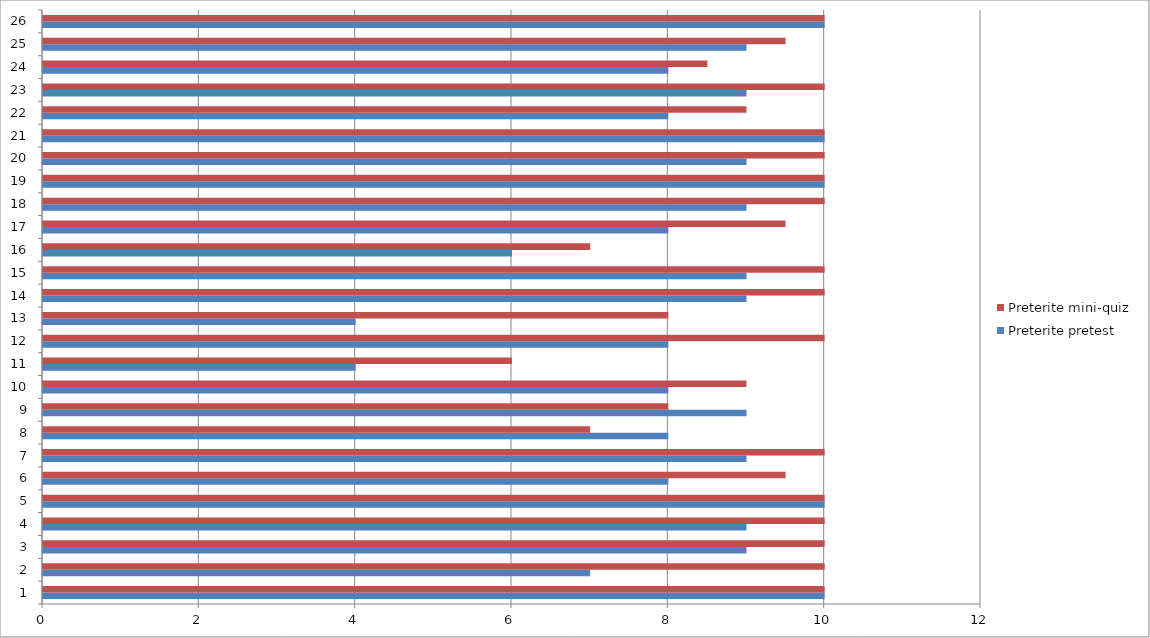
| Category | Preterite pretest | Preterite mini-quiz |
|---|---|---|
| 0 | 10 | 10 |
| 1 | 7 | 10 |
| 2 | 9 | 10 |
| 3 | 9 | 10 |
| 4 | 10 | 10 |
| 5 | 8 | 9.5 |
| 6 | 9 | 10 |
| 7 | 8 | 7 |
| 8 | 9 | 8 |
| 9 | 8 | 9 |
| 10 | 4 | 6 |
| 11 | 8 | 10 |
| 12 | 4 | 8 |
| 13 | 9 | 10 |
| 14 | 9 | 10 |
| 15 | 6 | 7 |
| 16 | 8 | 9.5 |
| 17 | 9 | 10 |
| 18 | 10 | 10 |
| 19 | 9 | 10 |
| 20 | 10 | 10 |
| 21 | 8 | 9 |
| 22 | 9 | 10 |
| 23 | 8 | 8.5 |
| 24 | 9 | 9.5 |
| 25 | 10 | 10 |